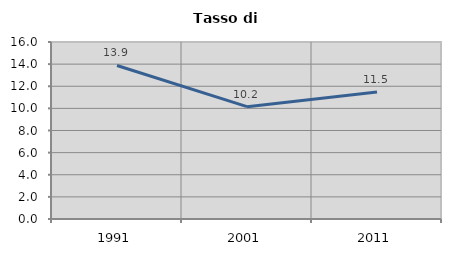
| Category | Tasso di disoccupazione   |
|---|---|
| 1991.0 | 13.876 |
| 2001.0 | 10.154 |
| 2011.0 | 11.478 |